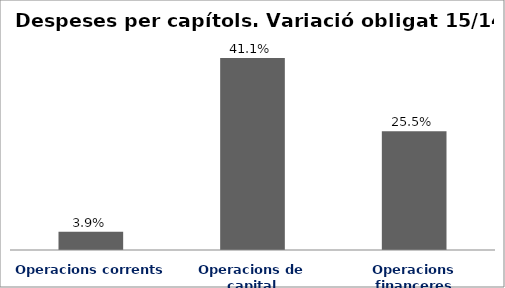
| Category | Series 0 |
|---|---|
| Operacions corrents | 0.039 |
| Operacions de capital | 0.411 |
| Operacions financeres | 0.255 |